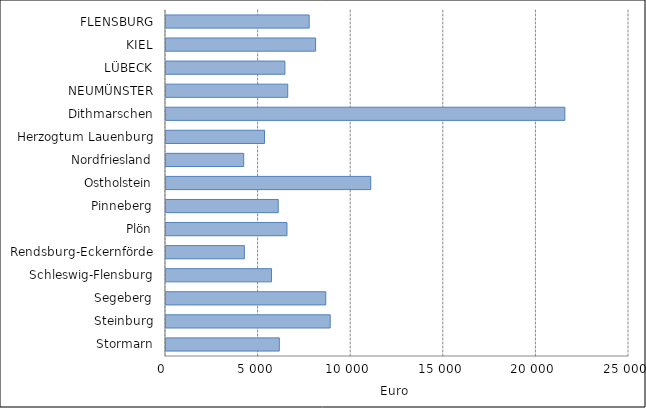
| Category | Euro |
|---|---|
| Stormarn | 6118.767 |
| Steinburg | 8866.969 |
| Segeberg | 8626.534 |
| Schleswig-Flensburg | 5698.027 |
| Rendsburg-Eckernförde | 4233.167 |
| Plön | 6532.072 |
| Pinneberg | 6060.143 |
| Ostholstein | 11054.609 |
| Nordfriesland | 4194.485 |
| Herzogtum Lauenburg | 5318.989 |
| Dithmarschen | 21537.247 |
| NEUMÜNSTER | 6572.871 |
| LÜBECK | 6420.996 |
| KIEL | 8076.429 |
| FLENSBURG | 7731.255 |